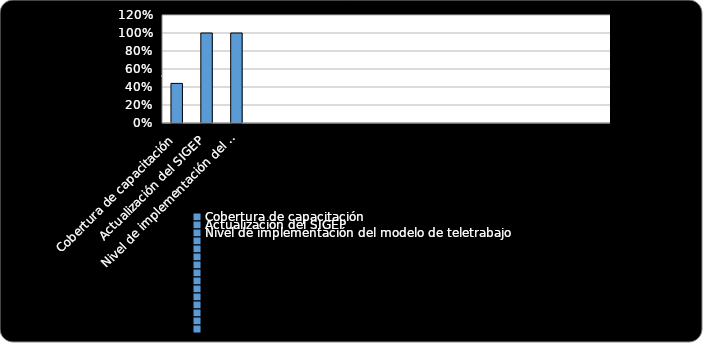
| Category | % Cumplimiento  |
|---|---|
| Cobertura de capacitación | 0.44 |
| Actualización del SIGEP | 1 |
| Nivel de implementación del modelo de teletrabajo | 1 |